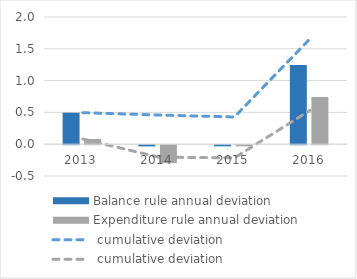
| Category | Balance rule | Expenditure rule |
|---|---|---|
| 2013.0 | 0.495 | 0.081 |
| 2014.0 | -0.019 | -0.282 |
| 2015.0 | -0.017 | -0.018 |
| 2016.0 | 1.243 | 0.743 |